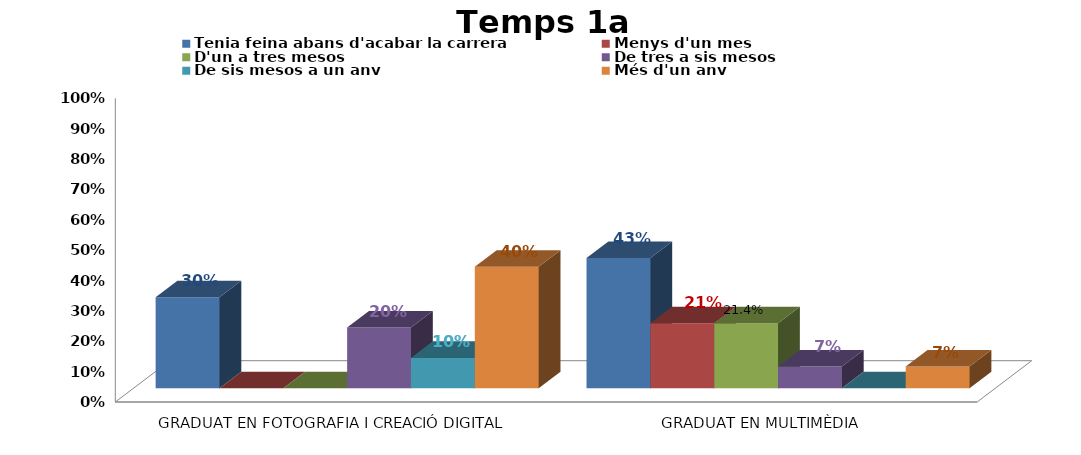
| Category | Tenia feina abans d'acabar la carrera | Menys d'un mes | D'un a tres mesos | De tres a sis mesos | De sis mesos a un any | Més d'un any |
|---|---|---|---|---|---|---|
| GRADUAT EN FOTOGRAFIA I CREACIÓ DIGITAL | 0.3 | 0 | 0 | 0.2 | 0.1 | 0.4 |
| GRADUAT EN MULTIMÈDIA | 0.429 | 0.214 | 0.214 | 0.071 | 0 | 0.071 |